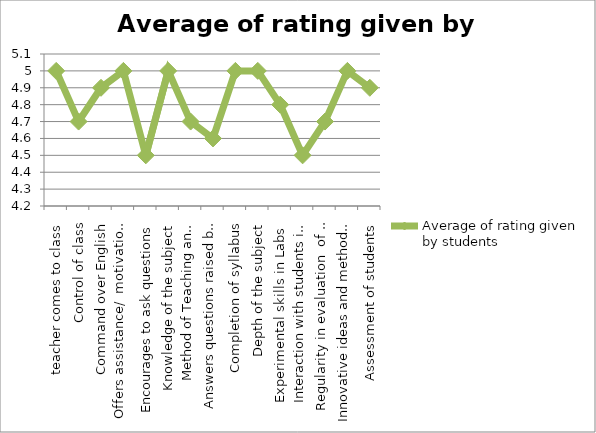
| Category | Average of rating given by students |
|---|---|
| teacher comes to class | 5 |
| Control of class | 4.7 |
| Command over English | 4.9 |
| Offers assistance/  motivation to learn | 5 |
| Encourages to ask questions | 4.5 |
| Knowledge of the subject | 5 |
| Method of Teaching and expression | 4.7 |
| Answers questions raised by you as per expectations | 4.6 |
| Completion of syllabus | 5 |
| Depth of the subject | 5 |
| Experimental skills in Labs  | 4.8 |
| Interaction with students in Tutorial class | 4.5 |
| Regularity in evaluation  of  assignments, class tests etc. | 4.7 |
| Innovative ideas and methods to teach | 5 |
| Assessment of students | 4.9 |